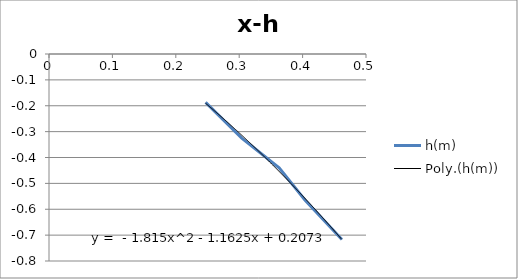
| Category | h(m) |
|---|---|
| 0.247 | -0.187 |
| 0.304 | -0.325 |
| 0.363 | -0.44 |
| 0.404 | -0.565 |
| 0.462 | -0.717 |